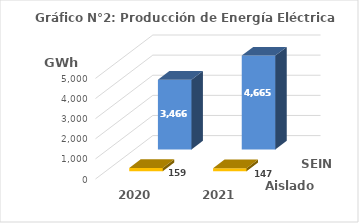
| Category | Aislados | SEIN |
|---|---|---|
| 2020.0 | 159.477 | 3466.251 |
| 2021.0 | 147.033 | 4665.381 |